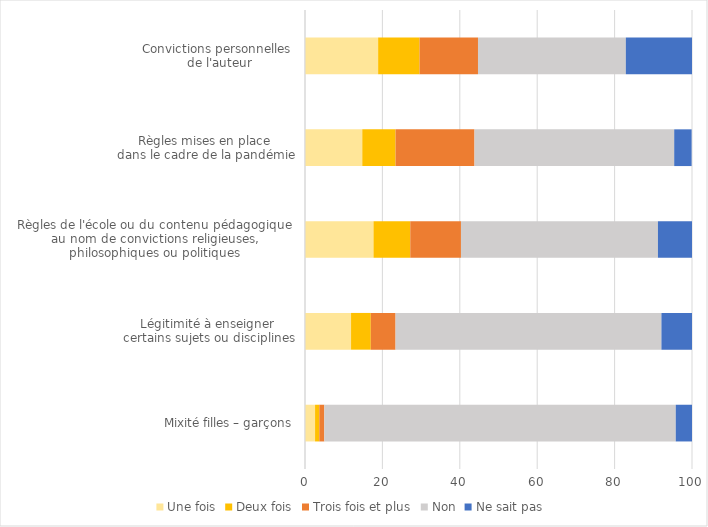
| Category | Une fois | Deux fois | Trois fois et plus | Non | Ne sait pas  |
|---|---|---|---|---|---|
| Mixité filles – garçons | 2.6 | 1.1 | 1.3 | 90.8 | 4.2 |
| Légitimité à enseigner 
certains sujets ou disciplines | 11.9 | 5.1 | 6.4 | 68.7 | 7.9 |
| Règles de l'école ou du contenu pédagogique
 au nom de convictions religieuses, 
philosophiques ou politiques | 17.7 | 9.5 | 13.1 | 50.9 | 8.8 |
| Règles mises en place 
dans le cadre de la pandémie | 14.8 | 8.6 | 20.4 | 51.6 | 4.5 |
| Convictions personnelles
 de l'auteur | 18.9 | 10.7 | 15.1 | 38.2 | 17.1 |